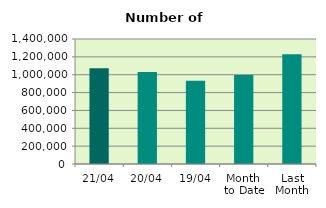
| Category | Series 0 |
|---|---|
| 21/04 | 1072138 |
| 20/04 | 1031166 |
| 19/04 | 931358 |
| Month 
to Date | 996906.462 |
| Last
Month | 1228285.652 |